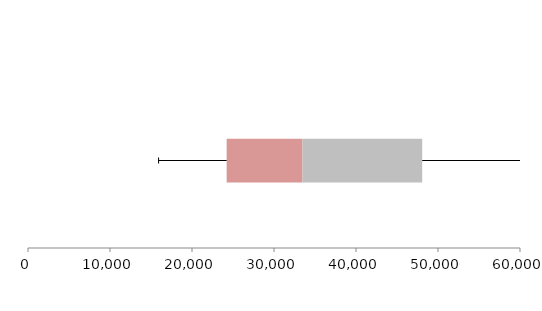
| Category | Series 1 | Series 2 | Series 3 |
|---|---|---|---|
| 0 | 24227.828 | 9247.655 | 14597.564 |